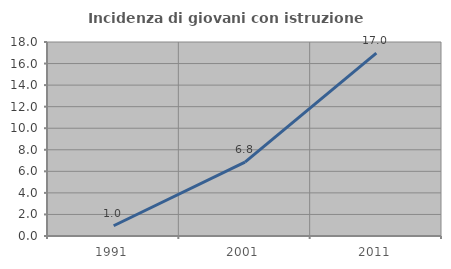
| Category | Incidenza di giovani con istruzione universitaria |
|---|---|
| 1991.0 | 0.952 |
| 2001.0 | 6.849 |
| 2011.0 | 16.964 |